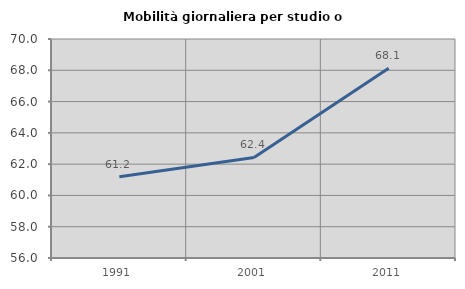
| Category | Mobilità giornaliera per studio o lavoro |
|---|---|
| 1991.0 | 61.191 |
| 2001.0 | 62.429 |
| 2011.0 | 68.132 |